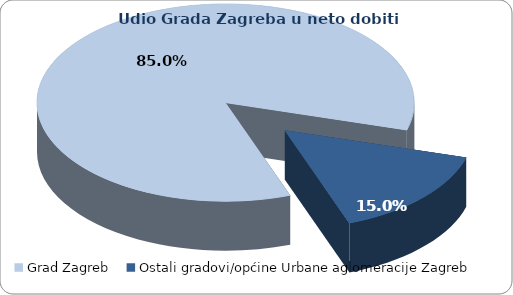
| Category | Series 2 |
|---|---|
| Grad Zagreb | 12190758.688 |
| Ostali gradovi/općine Urbane aglomeracije Zagreb | 2147243.647 |